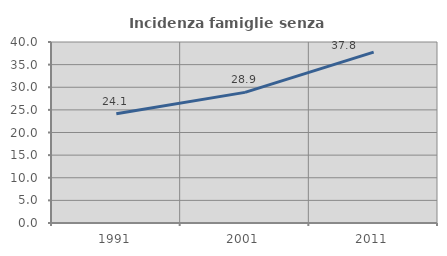
| Category | Incidenza famiglie senza nuclei |
|---|---|
| 1991.0 | 24.126 |
| 2001.0 | 28.863 |
| 2011.0 | 37.752 |